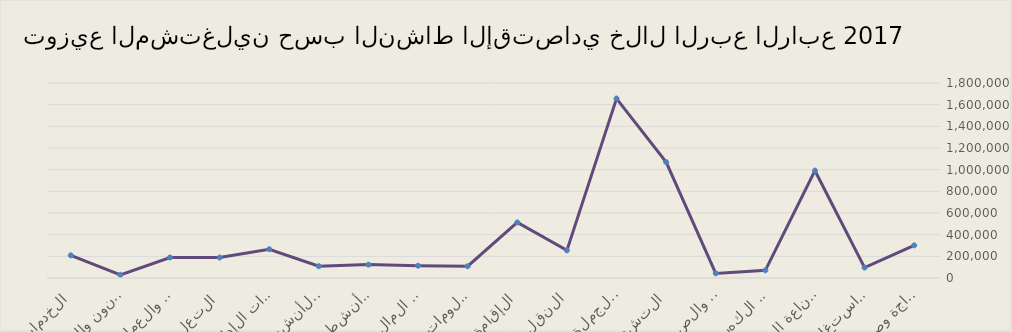
| Category | Series 0 |
|---|---|
| الزراعة والحراجة وصيد الأسماك | 301426 |
| التعدين واستغلال المحاجر | 96285 |
| الصناعة التحويلية | 990502 |
| توصيل الكهرباء والغاز  | 71120 |
| امدادات الماء والصرف الصحي | 42683 |
| التشييد | 1069424 |
| تجارة الجملة والتجزئة | 1656284 |
| النقل والتخزين | 255298 |
| الإقامة والطعام | 512777 |
| المعلومات والاتصالات | 108594 |
| أنشطة المال والتأمين | 113384 |
| الأنشطة العقارية | 123591 |
| الأنشطة المهنية  | 108823 |
| الخدمات الإدارية والدعم | 265651 |
| التعليم | 188733 |
| الصحة والعمل الاجتماعي | 189599 |
| الفنون والترفية | 29096 |
| الخدمات الأخرى | 209043 |